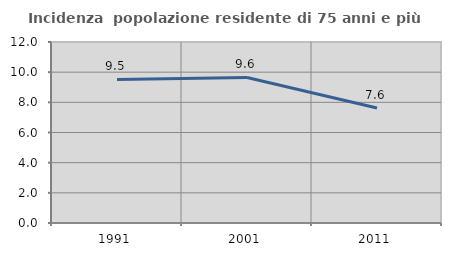
| Category | Incidenza  popolazione residente di 75 anni e più |
|---|---|
| 1991.0 | 9.518 |
| 2001.0 | 9.647 |
| 2011.0 | 7.63 |